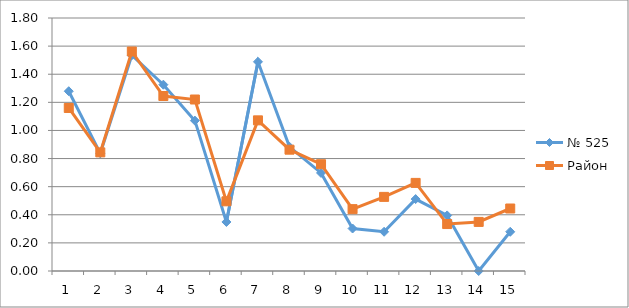
| Category | № 525 | Район |
|---|---|---|
| 0 | 1.279 | 1.16 |
| 1 | 0.837 | 0.844 |
| 2 | 1.535 | 1.562 |
| 3 | 1.326 | 1.245 |
| 4 | 1.07 | 1.22 |
| 5 | 0.349 | 0.496 |
| 6 | 1.488 | 1.072 |
| 7 | 0.884 | 0.863 |
| 8 | 0.698 | 0.76 |
| 9 | 0.302 | 0.44 |
| 10 | 0.279 | 0.527 |
| 11 | 0.512 | 0.627 |
| 12 | 0.395 | 0.334 |
| 13 | 0 | 0.349 |
| 14 | 0.279 | 0.445 |